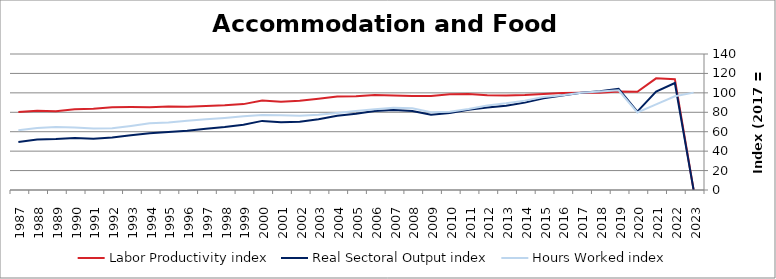
| Category | Labor Productivity index | Real Sectoral Output index | Hours Worked index |
|---|---|---|---|
| 2023.0 | 0 | 0 | 100.237 |
| 2022.0 | 114.073 | 110.08 | 96.5 |
| 2021.0 | 114.973 | 101.36 | 88.159 |
| 2020.0 | 101.16 | 80.696 | 79.77 |
| 2019.0 | 101.498 | 104.104 | 102.567 |
| 2018.0 | 100.101 | 101.598 | 101.495 |
| 2017.0 | 100 | 100 | 100 |
| 2016.0 | 99.895 | 97.359 | 97.461 |
| 2015.0 | 98.858 | 94.528 | 95.62 |
| 2014.0 | 97.75 | 89.943 | 92.013 |
| 2013.0 | 97.2 | 86.796 | 89.296 |
| 2012.0 | 97.514 | 84.93 | 87.095 |
| 2011.0 | 98.91 | 82.491 | 83.4 |
| 2010.0 | 98.491 | 79.313 | 80.529 |
| 2009.0 | 96.658 | 77.439 | 80.117 |
| 2008.0 | 96.759 | 81.315 | 84.039 |
| 2007.0 | 97.195 | 82.284 | 84.659 |
| 2006.0 | 97.698 | 81.212 | 83.126 |
| 2005.0 | 96.543 | 78.476 | 81.286 |
| 2004.0 | 96.319 | 76.345 | 79.262 |
| 2003.0 | 93.987 | 72.872 | 77.534 |
| 2002.0 | 91.936 | 70.364 | 76.536 |
| 2001.0 | 90.759 | 69.849 | 76.96 |
| 2000.0 | 92.01 | 71.148 | 77.327 |
| 1999.0 | 88.412 | 67.103 | 75.899 |
| 1998.0 | 87.215 | 64.743 | 74.234 |
| 1997.0 | 86.577 | 63.038 | 72.811 |
| 1996.0 | 85.805 | 61.107 | 71.216 |
| 1995.0 | 85.923 | 59.745 | 69.533 |
| 1994.0 | 85.128 | 58.467 | 68.682 |
| 1993.0 | 85.344 | 56.304 | 65.973 |
| 1992.0 | 85.191 | 54.149 | 63.562 |
| 1991.0 | 83.623 | 52.84 | 63.189 |
| 1990.0 | 83.155 | 53.462 | 64.292 |
| 1989.0 | 80.966 | 52.424 | 64.748 |
| 1988.0 | 81.524 | 51.955 | 63.73 |
| 1987.0 | 80.4 | 49.476 | 61.537 |